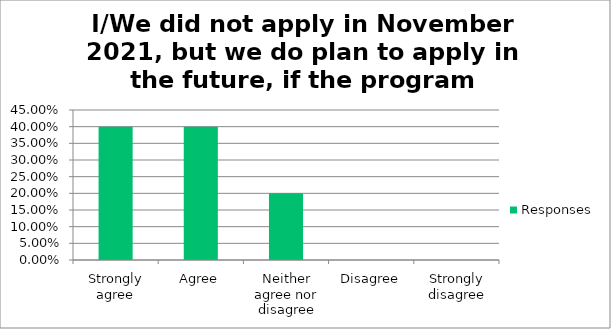
| Category | Responses |
|---|---|
| Strongly agree | 0.4 |
| Agree | 0.4 |
| Neither agree nor disagree | 0.2 |
| Disagree | 0 |
| Strongly disagree | 0 |